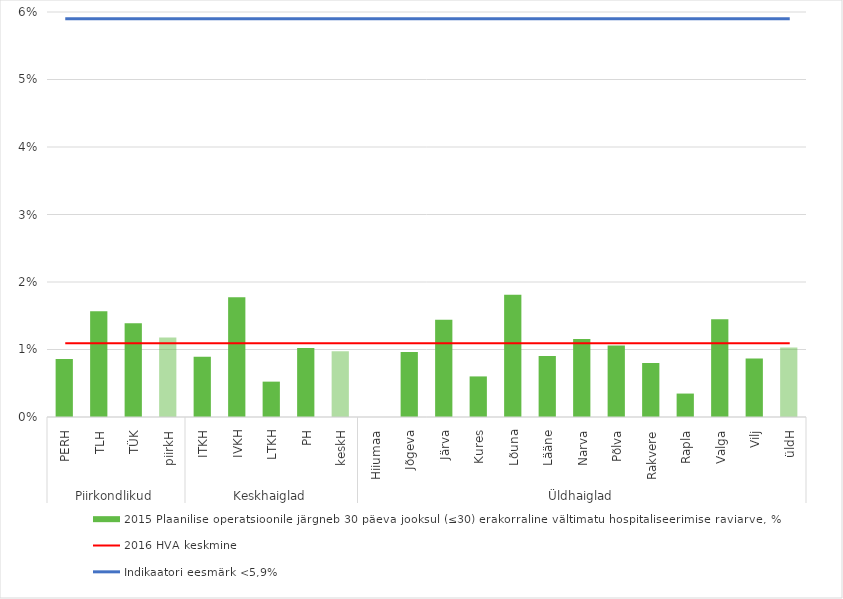
| Category | 2015 Plaanilise operatsioonile järgneb 30 päeva jooksul (≤30) erakorraline vältimatu hospitaliseerimise raviarve, % |
|---|---|
| 0 | 0.009 |
| 1 | 0.016 |
| 2 | 0.014 |
| 3 | 0.012 |
| 4 | 0.009 |
| 5 | 0.018 |
| 6 | 0.005 |
| 7 | 0.01 |
| 8 | 0.01 |
| 9 | 0 |
| 10 | 0.01 |
| 11 | 0.014 |
| 12 | 0.006 |
| 13 | 0.018 |
| 14 | 0.009 |
| 15 | 0.012 |
| 16 | 0.011 |
| 17 | 0.008 |
| 18 | 0.003 |
| 19 | 0.014 |
| 20 | 0.009 |
| 21 | 0.01 |